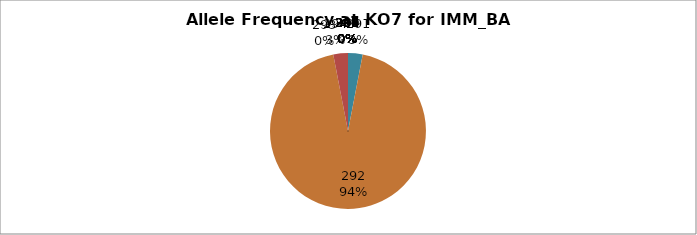
| Category | Series 0 |
|---|---|
| 260.0 | 0 |
| 285.0 | 0 |
| 289.0 | 0 |
| 290.0 | 0 |
| 291.0 | 0.03 |
| 292.0 | 0.939 |
| 293.0 | 0 |
| 294.0 | 0.03 |
| 295.0 | 0 |
| 296.0 | 0 |
| 297.0 | 0 |
| 298.0 | 0 |
| 299.0 | 0 |
| 300.0 | 0 |
| 301.0 | 0 |
| 302.0 | 0 |
| 304.0 | 0 |
| 305.0 | 0 |
| 306.0 | 0 |